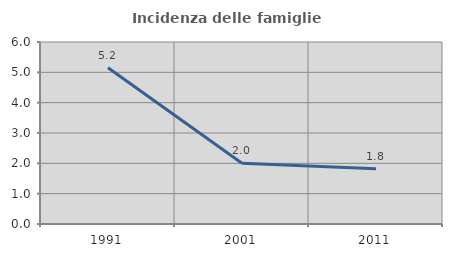
| Category | Incidenza delle famiglie numerose |
|---|---|
| 1991.0 | 5.154 |
| 2001.0 | 2.006 |
| 2011.0 | 1.825 |